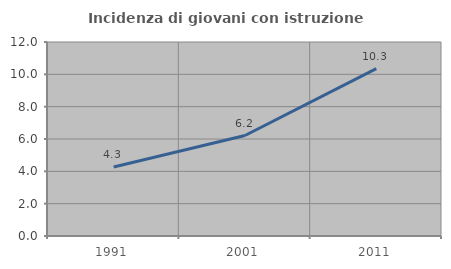
| Category | Incidenza di giovani con istruzione universitaria |
|---|---|
| 1991.0 | 4.265 |
| 2001.0 | 6.214 |
| 2011.0 | 10.349 |